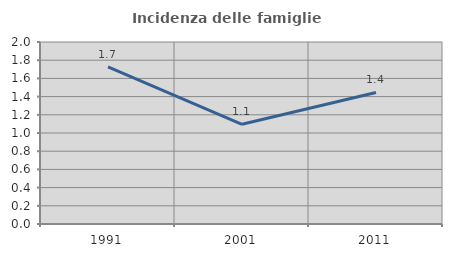
| Category | Incidenza delle famiglie numerose |
|---|---|
| 1991.0 | 1.726 |
| 2001.0 | 1.095 |
| 2011.0 | 1.446 |